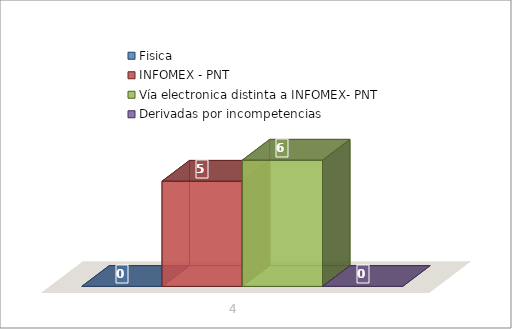
| Category | Fisica | INFOMEX - PNT | Vía electronica distinta a INFOMEX- PNT | Derivadas por incompetencias |
|---|---|---|---|---|
| 0 | 0 | 5 | 6 | 0 |